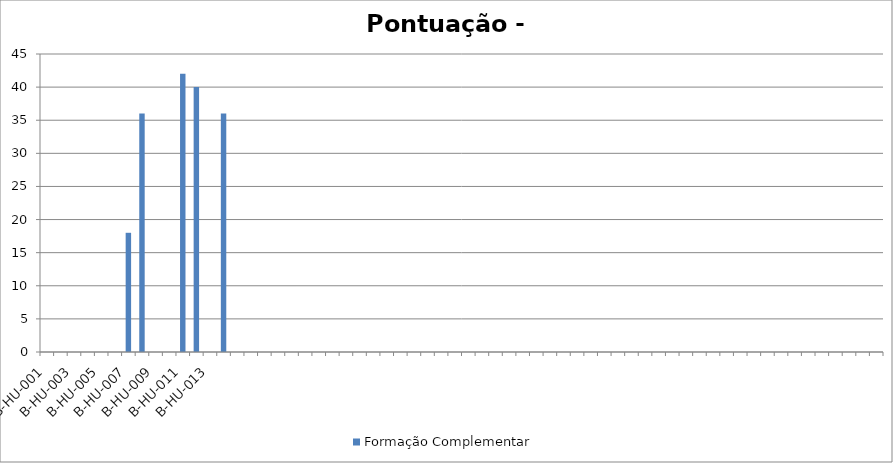
| Category | Formação Complementar |
|---|---|
| B-HU-001 | 0 |
| B-HU-002 | 0 |
| B-HU-003 | 0 |
| B-HU-004 | 0 |
| B-HU-005 | 0 |
| B-HU-006 | 0 |
| B-HU-007 | 18 |
| B-HU-008 | 36 |
| B-HU-009 | 0 |
| B-HU-010 | 0 |
| B-HU-011 | 42 |
| B-HU-012 | 40 |
| B-HU-013 | 0 |
| B-HU-014 | 36 |